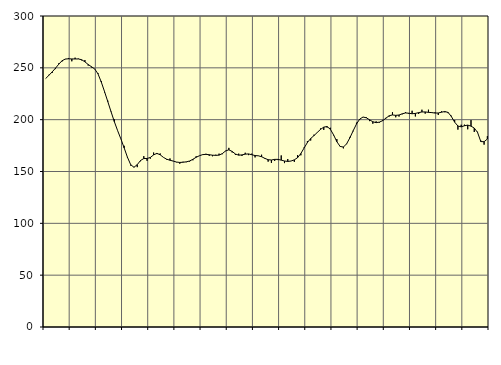
| Category | Piggar | Series 1 |
|---|---|---|
| nan | 239.7 | 239.65 |
| 87.0 | 243.3 | 242.8 |
| 87.0 | 245.1 | 246.07 |
| 87.0 | 248.8 | 249.6 |
| nan | 254.3 | 253.47 |
| 88.0 | 256.1 | 256.8 |
| 88.0 | 258.3 | 258.48 |
| 88.0 | 259.5 | 258.73 |
| nan | 256.3 | 258.58 |
| 89.0 | 259.8 | 258.54 |
| 89.0 | 258.9 | 258.57 |
| 89.0 | 257.2 | 257.83 |
| nan | 257.5 | 255.8 |
| 90.0 | 252.2 | 253.21 |
| 90.0 | 250.4 | 251.1 |
| 90.0 | 249 | 248.9 |
| nan | 244.9 | 244.19 |
| 91.0 | 237.2 | 236.37 |
| 91.0 | 226.3 | 227.07 |
| 91.0 | 218.3 | 217.39 |
| nan | 208 | 207.63 |
| 92.0 | 200.3 | 198.05 |
| 92.0 | 189.3 | 189.4 |
| 92.0 | 181.3 | 181.42 |
| nan | 174.8 | 172.77 |
| 93.0 | 163.1 | 163.76 |
| 93.0 | 155.7 | 156.57 |
| 93.0 | 154.4 | 154.07 |
| nan | 154.2 | 156.63 |
| 94.0 | 159.9 | 160.62 |
| 94.0 | 164.8 | 162.52 |
| 94.0 | 160.3 | 162.56 |
| nan | 162.4 | 163.52 |
| 95.0 | 168.3 | 166.03 |
| 95.0 | 166.8 | 167.49 |
| 95.0 | 167.4 | 166.12 |
| nan | 163.7 | 163.63 |
| 96.0 | 161.3 | 161.84 |
| 96.0 | 162.6 | 160.87 |
| 96.0 | 160.2 | 160.03 |
| nan | 158.9 | 159.11 |
| 97.0 | 157.5 | 158.73 |
| 97.0 | 159.4 | 158.95 |
| 97.0 | 159 | 159.32 |
| nan | 159.6 | 160.12 |
| 98.0 | 160.8 | 161.78 |
| 98.0 | 164.7 | 163.71 |
| 98.0 | 165.1 | 165.22 |
| nan | 166.5 | 166.29 |
| 99.0 | 167.1 | 166.52 |
| 99.0 | 165.1 | 166.19 |
| 99.0 | 164.7 | 165.73 |
| nan | 166.2 | 165.56 |
| 0.0 | 167.2 | 165.79 |
| 0.0 | 166.7 | 167.25 |
| 0.0 | 169.6 | 169.86 |
| nan | 172.8 | 170.91 |
| 1.0 | 168.4 | 169.36 |
| 1.0 | 166 | 166.88 |
| 1.0 | 167.2 | 165.74 |
| nan | 165 | 166.01 |
| 2.0 | 168.1 | 166.73 |
| 2.0 | 165.8 | 166.95 |
| 2.0 | 167.2 | 166.2 |
| nan | 163.6 | 165.4 |
| 3.0 | 165 | 165.14 |
| 3.0 | 166.2 | 164.27 |
| 3.0 | 162.2 | 162.65 |
| nan | 159.5 | 161.38 |
| 4.0 | 158.3 | 161.1 |
| 4.0 | 160.2 | 161.69 |
| 4.0 | 161 | 161.72 |
| nan | 165.5 | 160.95 |
| 5.0 | 158.1 | 160.13 |
| 5.0 | 162 | 159.7 |
| 5.0 | 160.1 | 160.11 |
| nan | 159.3 | 161.24 |
| 6.0 | 165.8 | 163.33 |
| 6.0 | 165.6 | 167.36 |
| 6.0 | 173.3 | 172.71 |
| nan | 179.3 | 177.95 |
| 7.0 | 179.9 | 181.82 |
| 7.0 | 185.5 | 184.58 |
| 7.0 | 187.5 | 187.61 |
| nan | 191.5 | 190.58 |
| 8.0 | 190.1 | 192.79 |
| 8.0 | 192.4 | 193.4 |
| 8.0 | 192.2 | 190.78 |
| nan | 184.9 | 185.36 |
| 9.0 | 181.3 | 178.74 |
| 9.0 | 173.9 | 174.18 |
| 9.0 | 172.3 | 173.58 |
| nan | 176.4 | 176.76 |
| 10.0 | 183.4 | 182.59 |
| 10.0 | 188.8 | 189.38 |
| 10.0 | 197.1 | 195.77 |
| nan | 200.1 | 200.58 |
| 11.0 | 202.6 | 202.54 |
| 11.0 | 202.4 | 201.81 |
| 11.0 | 198.6 | 199.88 |
| nan | 196.1 | 197.98 |
| 12.0 | 198.4 | 197.13 |
| 12.0 | 197.1 | 197.63 |
| 12.0 | 199.8 | 199.04 |
| nan | 201.8 | 201.42 |
| 13.0 | 203 | 203.8 |
| 13.0 | 207.2 | 204.55 |
| 13.0 | 202.3 | 204.16 |
| nan | 203 | 204.48 |
| 14.0 | 205.2 | 205.68 |
| 14.0 | 207.3 | 206.5 |
| 14.0 | 205.6 | 206.19 |
| nan | 208.6 | 205.7 |
| 15.0 | 203.1 | 206.04 |
| 15.0 | 205.5 | 206.78 |
| 15.0 | 209.6 | 207.44 |
| nan | 205.8 | 207.45 |
| 16.0 | 209.6 | 207.06 |
| 16.0 | 207.2 | 206.81 |
| 16.0 | 207.1 | 206.38 |
| nan | 204.5 | 206.45 |
| 17.0 | 208.1 | 207.21 |
| 17.0 | 207.1 | 207.85 |
| 17.0 | 206.3 | 206.98 |
| nan | 203.8 | 203.03 |
| 18.0 | 199.7 | 197.61 |
| 18.0 | 190.4 | 193.89 |
| 18.0 | 195.1 | 193.08 |
| nan | 195.2 | 194.14 |
| 19.0 | 190.7 | 194.74 |
| 19.0 | 199.6 | 193.77 |
| 19.0 | 188.1 | 191.89 |
| nan | 188.3 | 187.68 |
| 20.0 | 179.8 | 178.87 |
| 20.0 | 175.9 | 178.73 |
| 20.0 | 184.1 | 181.34 |